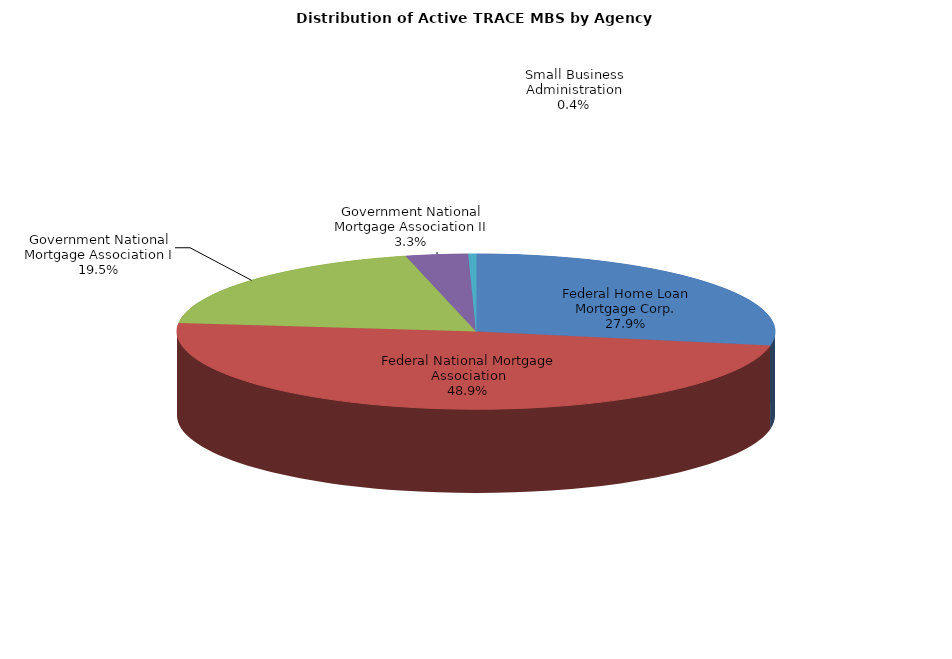
| Category | Series 0 |
|---|---|
| Federal Home Loan Mortgage Corp. | 295686 |
| Federal National Mortgage Association | 517996 |
| Government National Mortgage Association I | 206609 |
| Government National Mortgage Association II | 35504 |
| Small Business Administration | 4434 |